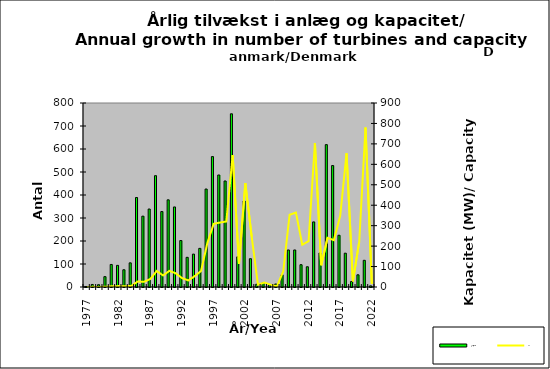
| Category | Antal/No |
|---|---|
| 1977.0 | 2 |
| 1978.0 | 11 |
| 1979.0 | 10 |
| 1980.0 | 45 |
| 1981.0 | 98 |
| 1982.0 | 94 |
| 1983.0 | 75 |
| 1984.0 | 105 |
| 1985.0 | 389 |
| 1986.0 | 308 |
| 1987.0 | 339 |
| 1988.0 | 484 |
| 1989.0 | 328 |
| 1990.0 | 379 |
| 1991.0 | 348 |
| 1992.0 | 202 |
| 1993.0 | 129 |
| 1994.0 | 143 |
| 1995.0 | 168 |
| 1996.0 | 426 |
| 1997.0 | 567 |
| 1998.0 | 487 |
| 1999.0 | 461 |
| 2000.0 | 753 |
| 2001.0 | 131 |
| 2002.0 | 374 |
| 2003.0 | 123 |
| 2004.0 | 12 |
| 2005.0 | 18 |
| 2006.0 | 10 |
| 2007.0 | 13 |
| 2008.0 | 53 |
| 2009.0 | 161 |
| 2010.0 | 161 |
| 2011.0 | 97 |
| 2012.0 | 88 |
| 2013.0 | 283 |
| 2014.0 | 148 |
| 2015.0 | 619 |
| 2016.0 | 528 |
| 2017.0 | 225 |
| 2018.0 | 147 |
| 2019.0 | 24 |
| 2020.0 | 53 |
| 2021.0 | 116 |
| 2022.0 | 5 |